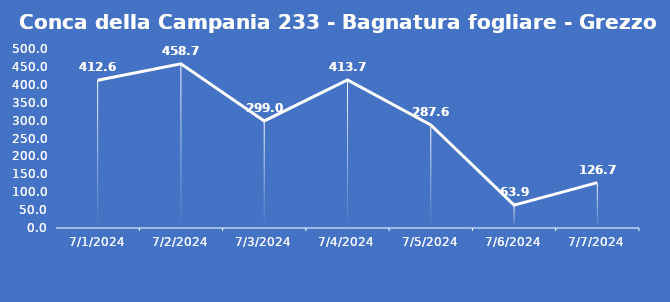
| Category | Conca della Campania 233 - Bagnatura fogliare - Grezzo (min) |
|---|---|
| 7/1/24 | 412.6 |
| 7/2/24 | 458.7 |
| 7/3/24 | 299 |
| 7/4/24 | 413.7 |
| 7/5/24 | 287.6 |
| 7/6/24 | 63.9 |
| 7/7/24 | 126.7 |